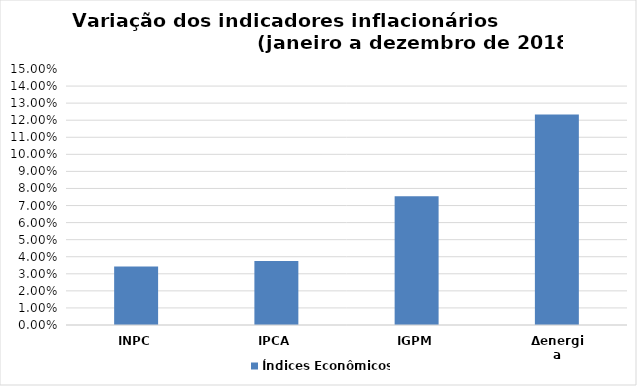
| Category | Índices Econômicos |
|---|---|
| INPC | 0.034 |
| IPCA | 0.037 |
| IGPM | 0.075 |
| Δenergia | 0.123 |